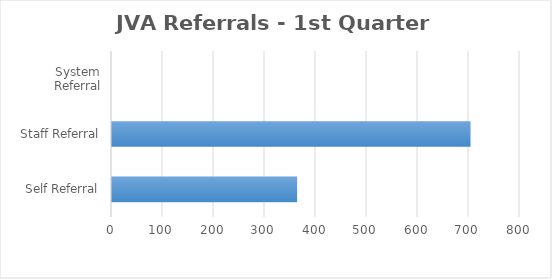
| Category | Series 0 |
|---|---|
| Self Referral | 363 |
| Staff Referral | 703 |
| System Referral | 0 |